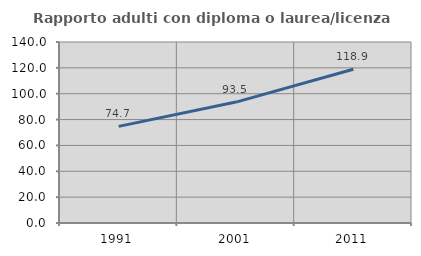
| Category | Rapporto adulti con diploma o laurea/licenza media  |
|---|---|
| 1991.0 | 74.738 |
| 2001.0 | 93.529 |
| 2011.0 | 118.916 |